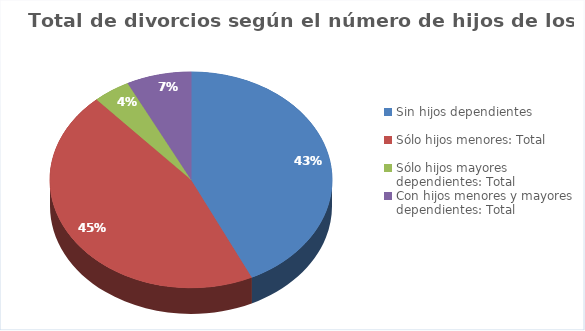
| Category | Series 0 |
|---|---|
| Sin hijos dependientes | 37283 |
| Sólo hijos menores: Total | 39440 |
| Sólo hijos mayores dependientes: Total | 3698 |
| Con hijos menores y mayores dependientes: Total | 6431 |